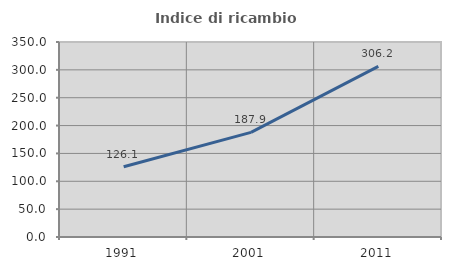
| Category | Indice di ricambio occupazionale  |
|---|---|
| 1991.0 | 126.136 |
| 2001.0 | 187.879 |
| 2011.0 | 306.154 |